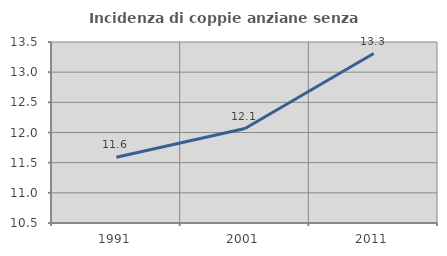
| Category | Incidenza di coppie anziane senza figli  |
|---|---|
| 1991.0 | 11.59 |
| 2001.0 | 12.066 |
| 2011.0 | 13.308 |